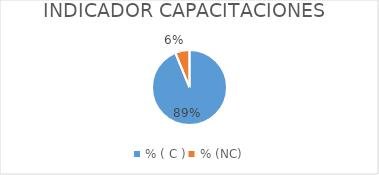
| Category | Series 0 |
|---|---|
| % ( C ) | 0.895 |
| % (NC) | 0.059 |